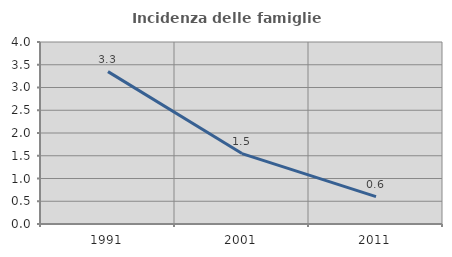
| Category | Incidenza delle famiglie numerose |
|---|---|
| 1991.0 | 3.349 |
| 2001.0 | 1.548 |
| 2011.0 | 0.603 |